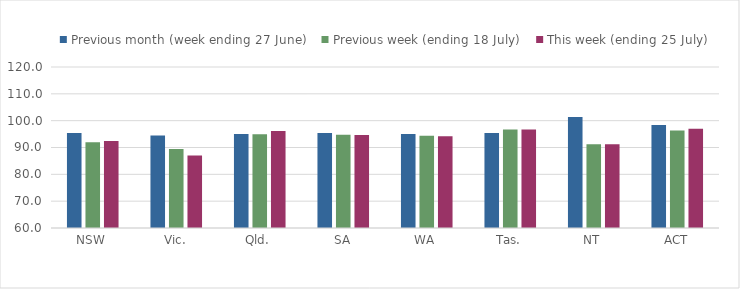
| Category | Previous month (week ending 27 June) | Previous week (ending 18 July) | This week (ending 25 July) |
|---|---|---|---|
| NSW | 95.407 | 91.933 | 92.445 |
| Vic. | 94.468 | 89.479 | 87.045 |
| Qld. | 95.07 | 94.969 | 96.124 |
| SA | 95.42 | 94.758 | 94.621 |
| WA | 94.999 | 94.368 | 94.225 |
| Tas. | 95.389 | 96.723 | 96.747 |
| NT | 101.411 | 91.232 | 91.232 |
| ACT | 98.361 | 96.305 | 97.034 |